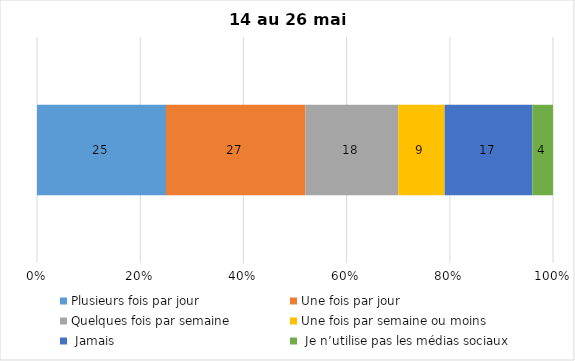
| Category | Plusieurs fois par jour | Une fois par jour | Quelques fois par semaine   | Une fois par semaine ou moins   |  Jamais   |  Je n’utilise pas les médias sociaux |
|---|---|---|---|---|---|---|
| 0 | 25 | 27 | 18 | 9 | 17 | 4 |